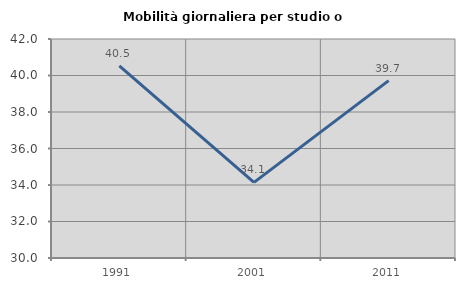
| Category | Mobilità giornaliera per studio o lavoro |
|---|---|
| 1991.0 | 40.526 |
| 2001.0 | 34.146 |
| 2011.0 | 39.719 |